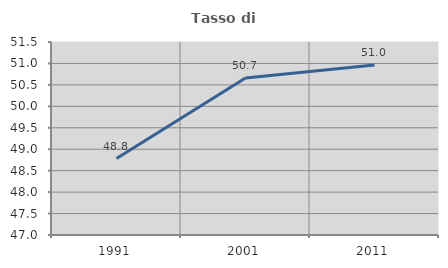
| Category | Tasso di occupazione   |
|---|---|
| 1991.0 | 48.782 |
| 2001.0 | 50.661 |
| 2011.0 | 50.964 |